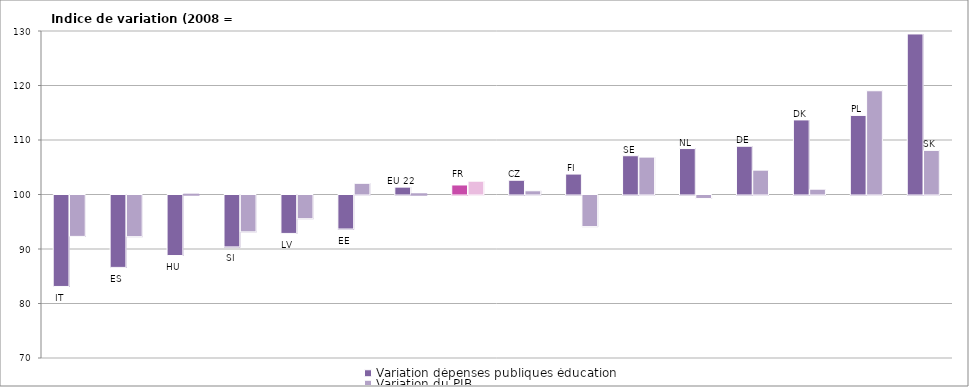
| Category | Variation dépenses publiques éducation | Variation du PIB |
|---|---|---|
| IT | 83.22 | 92.403 |
| ES | 86.717 | 92.353 |
| HU | 88.896 | 100.057 |
| SI | 90.472 | 93.239 |
| LV | 92.949 | 95.647 |
| EE | 93.756 | 102.055 |
| EU 22 | 101.354 | 100.124 |
| FR | 101.749 | 102.44 |
| CZ | 102.615 | 100.684 |
| FI | 103.752 | 94.2 |
| SE | 107.114 | 106.865 |
| NL | 108.43 | 99.361 |
| DE | 108.851 | 104.47 |
| DK | 113.685 | 100.973 |
| PL | 114.512 | 119.035 |
| SK | 129.457 | 108.096 |